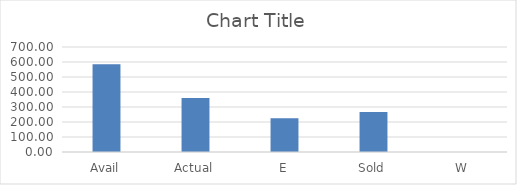
| Category | Series 0 |
|---|---|
| Avail | 585.6 |
| Actual | 360.63 |
| E | 225.37 |
| Sold | 266.35 |
| W | 0 |